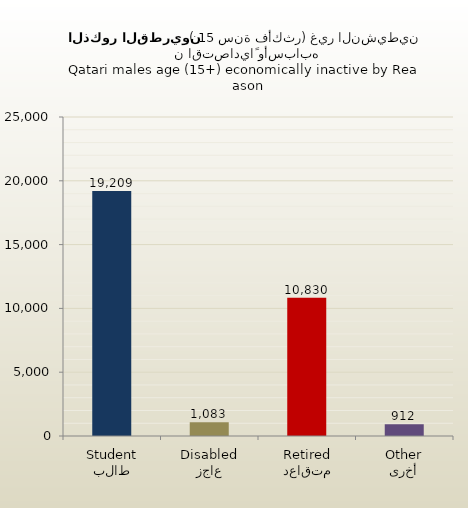
| Category | الذكور القطريين |
|---|---|
| طالب
Student | 19209 |
| عاجز
Disabled | 1083 |
| متقاعد
Retired | 10830 |
| أخرى
Other | 912 |